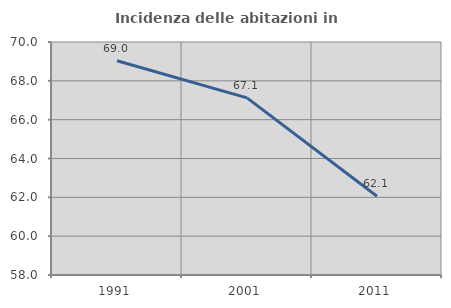
| Category | Incidenza delle abitazioni in proprietà  |
|---|---|
| 1991.0 | 69.032 |
| 2001.0 | 67.123 |
| 2011.0 | 62.055 |